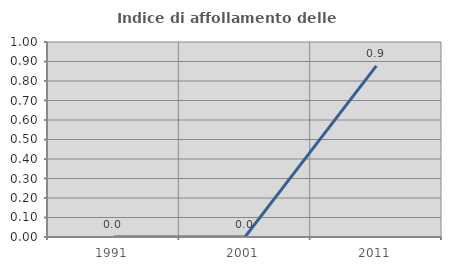
| Category | Indice di affollamento delle abitazioni  |
|---|---|
| 1991.0 | 0 |
| 2001.0 | 0 |
| 2011.0 | 0.877 |